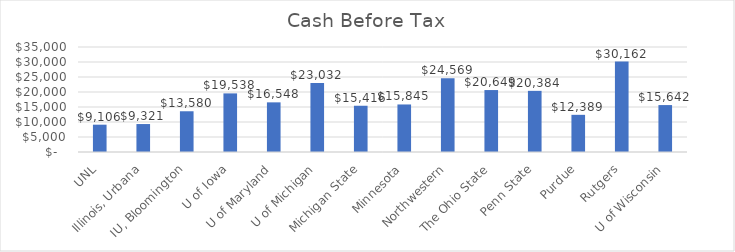
| Category | Series 0 |
|---|---|
| UNL | 9105.886 |
| Illinois, Urbana | 9320.92 |
| IU, Bloomington | 13579.54 |
| U of Iowa | 19538.35 |
| U of Maryland | 16548.2 |
| U of Michigan | 23031.81 |
| Michigan State | 15416 |
| Minnesota | 15845.402 |
| Northwestern | 24569 |
| The Ohio State | 20648.8 |
| Penn State | 20384 |
| Purdue | 12388.8 |
| Rutgers | 30162 |
| U of Wisconsin | 15642 |